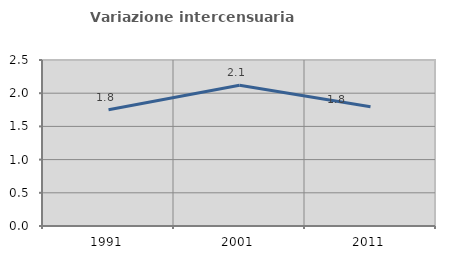
| Category | Variazione intercensuaria annua |
|---|---|
| 1991.0 | 1.751 |
| 2001.0 | 2.12 |
| 2011.0 | 1.797 |